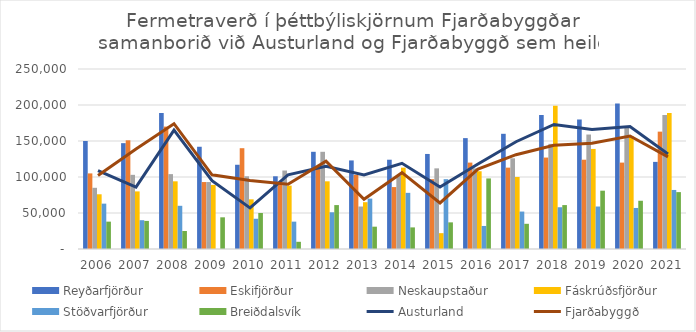
| Category | Reyðarfjörður | Eskifjörður | Neskaupstaður | Fáskrúðsfjörður | Stöðvarfjörður | Breiðdalsvík |
|---|---|---|---|---|---|---|
| 2006.0 | 150000 | 105000 | 85000 | 76000 | 63000 | 38000 |
| 2007.0 | 147000 | 151000 | 103000 | 80000 | 40000 | 39000 |
| 2008.0 | 189000 | 170000 | 104000 | 94000 | 60000 | 25000 |
| 2009.0 | 142000 | 93000 | 93000 | 89000 | 0 | 44000 |
| 2010.0 | 117000 | 140000 | 101000 | 69000 | 42000 | 50000 |
| 2011.0 | 101000 | 92000 | 109000 | 88000 | 38000 | 10000 |
| 2012.0 | 135000 | 111000 | 135000 | 94000 | 51000 | 61000 |
| 2013.0 | 123000 | 103000 | 59000 | 65000 | 70000 | 31000 |
| 2014.0 | 124000 | 86000 | 102000 | 113000 | 78000 | 30000 |
| 2015.0 | 132000 | 97000 | 112000 | 22000 | 97000 | 37000 |
| 2016.0 | 154000 | 120000 | 112000 | 108000 | 32000 | 98000 |
| 2017.0 | 160000 | 113000 | 126000 | 100000 | 52000 | 35000 |
| 2018.0 | 186000 | 127000 | 146000 | 199000 | 58000 | 61000 |
| 2019.0 | 180000 | 124000 | 159000 | 139000 | 59000 | 81000 |
| 2020.0 | 202000 | 120000 | 169000 | 157000 | 57000 | 67000 |
| 2021.0 | 121000 | 163000 | 186000 | 189000 | 82000 | 79000 |